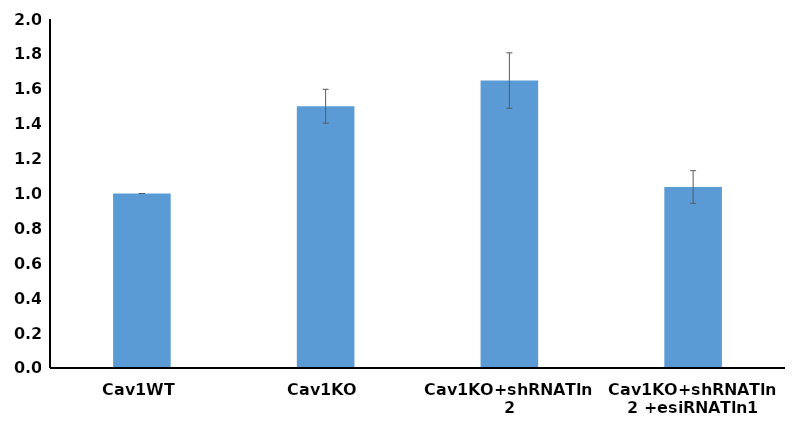
| Category | Series 0 |
|---|---|
| Cav1WT | 1 |
| Cav1KO | 1.5 |
| Cav1KO+shRNATln2 | 1.647 |
| Cav1KO+shRNATln2 +esiRNATln1 | 1.037 |